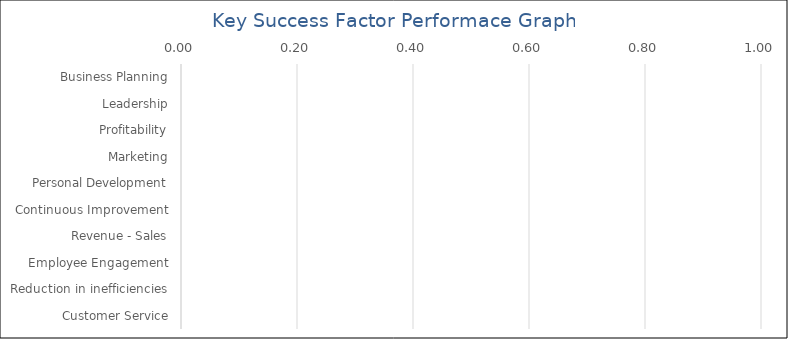
| Category | Series 0 |
|---|---|
| Business Planning | 0 |
| Leadership | 0 |
| Profitability | 0 |
| Marketing | 0 |
| Personal Development | 0 |
| Continuous Improvement | 0 |
| Revenue - Sales | 0 |
| Employee Engagement | 0 |
| Reduction in inefficiencies | 0 |
| Customer Service | 0 |